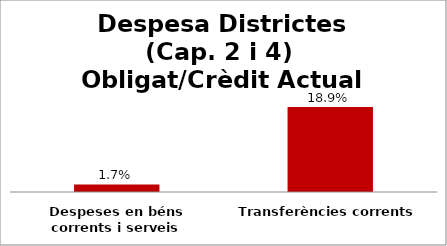
| Category | Series 0 |
|---|---|
| Despeses en béns corrents i serveis | 0.017 |
| Transferències corrents | 0.189 |